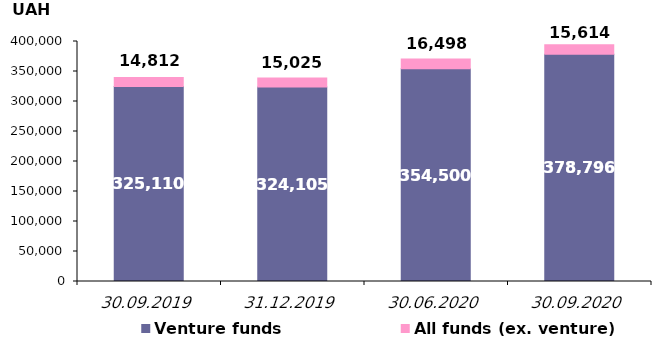
| Category | Venture funds | All funds (ex. venture) |
|---|---|---|
| 30.09.2019 | 325109.898 | 14811.829 |
| 31.12.2019 | 324105.005 | 15024.795 |
| 30.06.2020 | 354500.307 | 16497.816 |
| 30.09.2020 | 378795.599 | 15614.401 |